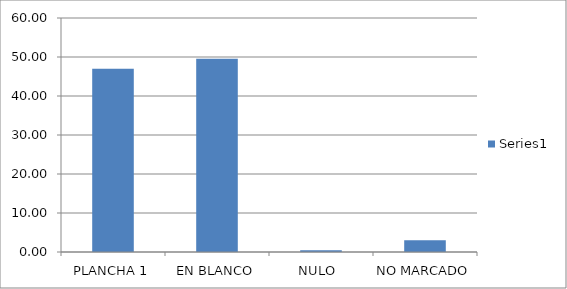
| Category | Series 0 |
|---|---|
| PLANCHA 1 | 47.009 |
| EN BLANCO | 49.573 |
| NULO  | 0.427 |
| NO MARCADO | 2.991 |